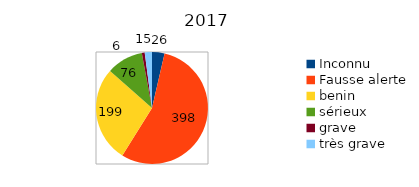
| Category | Series 0 |
|---|---|
| Inconnu | 26 |
| Fausse alerte | 398 |
| benin | 199 |
| sérieux | 76 |
| grave | 6 |
| très grave | 15 |